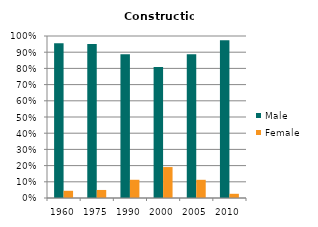
| Category | Male | Female |
|---|---|---|
| 1960.0 | 0.956 | 0.044 |
| 1975.0 | 0.95 | 0.05 |
| 1990.0 | 0.888 | 0.112 |
| 2000.0 | 0.809 | 0.191 |
| 2005.0 | 0.888 | 0.112 |
| 2010.0 | 0.974 | 0.026 |